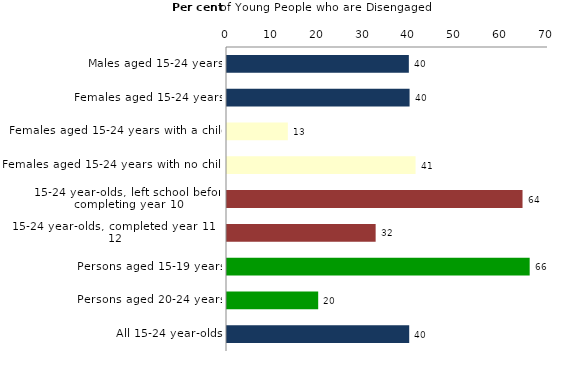
| Category | Series 0 |
|---|---|
| Males aged 15-24 years | 39.656 |
| Females aged 15-24 years | 39.815 |
| Females aged 15-24 years with a child | 13.268 |
| Females aged 15-24 years with no child | 41.121 |
| 15-24 year-olds, left school before completing year 10 | 64.446 |
| 15-24 year-olds, completed year 11 or 12 | 32.415 |
| Persons aged 15-19 years | 66.004 |
| Persons aged 20-24 years | 19.886 |
| All 15-24 year-olds | 39.735 |